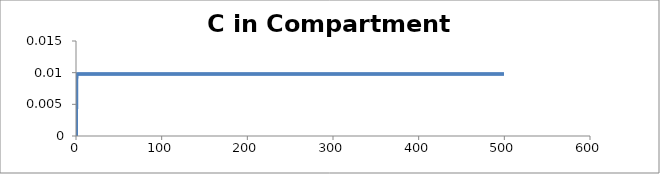
| Category | C - Sys 2 |
|---|---|
| 0.5 | 0 |
| 1.0 | 0.009 |
| 1.5 | 0.01 |
| 2.0 | 0.01 |
| 2.5 | 0.01 |
| 3.0 | 0.01 |
| 3.5 | 0.01 |
| 4.0 | 0.01 |
| 4.500000000000001 | 0.01 |
| 5.0 | 0.01 |
| 5.5 | 0.01 |
| 6.0 | 0.01 |
| 6.500000000000001 | 0.01 |
| 7.0 | 0.01 |
| 7.5 | 0.01 |
| 8.0 | 0.01 |
| 8.5 | 0.01 |
| 9.000000000000002 | 0.01 |
| 9.5 | 0.01 |
| 10.0 | 0.01 |
| 10.5 | 0.01 |
| 11.0 | 0.01 |
| 11.5 | 0.01 |
| 12.0 | 0.01 |
| 12.5 | 0.01 |
| 13.000000000000002 | 0.01 |
| 13.5 | 0.01 |
| 14.0 | 0.01 |
| 14.5 | 0.01 |
| 15.0 | 0.01 |
| 15.5 | 0.01 |
| 16.0 | 0.01 |
| 16.5 | 0.01 |
| 17.0 | 0.01 |
| 17.5 | 0.01 |
| 18.000000000000004 | 0.01 |
| 18.5 | 0.01 |
| 19.0 | 0.01 |
| 19.5 | 0.01 |
| 20.0 | 0.01 |
| 20.5 | 0.01 |
| 21.0 | 0.01 |
| 21.5 | 0.01 |
| 22.0 | 0.01 |
| 22.5 | 0.01 |
| 23.0 | 0.01 |
| 23.5 | 0.01 |
| 24.0 | 0.01 |
| 24.5 | 0.01 |
| 25.0 | 0.01 |
| 25.500000000000004 | 0.01 |
| 26.000000000000004 | 0.01 |
| 26.5 | 0.01 |
| 27.0 | 0.01 |
| 27.5 | 0.01 |
| 28.0 | 0.01 |
| 28.5 | 0.01 |
| 29.0 | 0.01 |
| 29.500000000000004 | 0.01 |
| 30.0 | 0.01 |
| 30.5 | 0.01 |
| 31.0 | 0.01 |
| 31.5 | 0.01 |
| 32.0 | 0.01 |
| 32.5 | 0.01 |
| 33.0 | 0.01 |
| 33.5 | 0.01 |
| 34.0 | 0.01 |
| 34.5 | 0.01 |
| 35.0 | 0.01 |
| 35.50000000000001 | 0.01 |
| 36.00000000000001 | 0.01 |
| 36.5 | 0.01 |
| 37.0 | 0.01 |
| 37.5 | 0.01 |
| 38.0 | 0.01 |
| 38.5 | 0.01 |
| 39.0 | 0.01 |
| 39.5 | 0.01 |
| 40.0 | 0.01 |
| 40.5 | 0.01 |
| 41.0 | 0.01 |
| 41.5 | 0.01 |
| 42.0 | 0.01 |
| 42.5 | 0.01 |
| 43.0 | 0.01 |
| 43.50000000000001 | 0.01 |
| 44.0 | 0.01 |
| 44.5 | 0.01 |
| 45.0 | 0.01 |
| 45.5 | 0.01 |
| 46.0 | 0.01 |
| 46.5 | 0.01 |
| 47.0 | 0.01 |
| 47.5 | 0.01 |
| 48.0 | 0.01 |
| 48.5 | 0.01 |
| 49.0 | 0.01 |
| 49.5 | 0.01 |
| 50.0 | 0.01 |
| 50.5 | 0.01 |
| 51.00000000000001 | 0.01 |
| 51.50000000000001 | 0.01 |
| 52.00000000000001 | 0.01 |
| 52.5 | 0.01 |
| 53.0 | 0.01 |
| 53.5 | 0.01 |
| 54.0 | 0.01 |
| 54.5 | 0.01 |
| 55.0 | 0.01 |
| 55.5 | 0.01 |
| 56.0 | 0.01 |
| 56.5 | 0.01 |
| 57.0 | 0.01 |
| 57.5 | 0.01 |
| 58.0 | 0.01 |
| 58.5 | 0.01 |
| 59.00000000000001 | 0.01 |
| 59.50000000000001 | 0.01 |
| 60.0 | 0.01 |
| 60.5 | 0.01 |
| 61.0 | 0.01 |
| 61.5 | 0.01 |
| 62.0 | 0.01 |
| 62.5 | 0.01 |
| 63.0 | 0.01 |
| 63.5 | 0.01 |
| 64.0 | 0.01 |
| 64.5 | 0.01 |
| 65.0 | 0.01 |
| 65.5 | 0.01 |
| 66.0 | 0.01 |
| 66.5 | 0.01 |
| 67.0 | 0.01 |
| 67.5 | 0.01 |
| 68.0 | 0.01 |
| 68.5 | 0.01 |
| 69.0 | 0.01 |
| 69.5 | 0.01 |
| 70.0 | 0.01 |
| 70.5 | 0.01 |
| 71.00000000000001 | 0.01 |
| 71.50000000000001 | 0.01 |
| 72.00000000000001 | 0.01 |
| 72.5 | 0.01 |
| 73.0 | 0.01 |
| 73.5 | 0.01 |
| 74.0 | 0.01 |
| 74.5 | 0.01 |
| 75.0 | 0.01 |
| 75.5 | 0.01 |
| 76.0 | 0.01 |
| 76.5 | 0.01 |
| 77.0 | 0.01 |
| 77.5 | 0.01 |
| 78.0 | 0.01 |
| 78.5 | 0.01 |
| 79.0 | 0.01 |
| 79.5 | 0.01 |
| 80.0 | 0.01 |
| 80.5 | 0.01 |
| 81.0 | 0.01 |
| 81.5 | 0.01 |
| 82.0 | 0.01 |
| 82.5 | 0.01 |
| 83.0 | 0.01 |
| 83.5 | 0.01 |
| 84.0 | 0.01 |
| 84.5 | 0.01 |
| 85.0 | 0.01 |
| 85.5 | 0.01 |
| 86.0 | 0.01 |
| 86.50000000000001 | 0.01 |
| 87.00000000000001 | 0.01 |
| 87.50000000000001 | 0.01 |
| 88.0 | 0.01 |
| 88.5 | 0.01 |
| 89.0 | 0.01 |
| 89.5 | 0.01 |
| 90.0 | 0.01 |
| 90.5 | 0.01 |
| 91.0 | 0.01 |
| 91.5 | 0.01 |
| 92.0 | 0.01 |
| 92.5 | 0.01 |
| 93.0 | 0.01 |
| 93.5 | 0.01 |
| 94.0 | 0.01 |
| 94.5 | 0.01 |
| 95.0 | 0.01 |
| 95.5 | 0.01 |
| 96.0 | 0.01 |
| 96.5 | 0.01 |
| 97.0 | 0.01 |
| 97.5 | 0.01 |
| 98.0 | 0.01 |
| 98.5 | 0.01 |
| 99.0 | 0.01 |
| 99.5 | 0.01 |
| 100.0 | 0.01 |
| 100.5 | 0.01 |
| 101.0 | 0.01 |
| 101.5 | 0.01 |
| 102.00000000000001 | 0.01 |
| 102.50000000000001 | 0.01 |
| 103.00000000000001 | 0.01 |
| 103.50000000000001 | 0.01 |
| 104.00000000000001 | 0.01 |
| 104.5 | 0.01 |
| 105.0 | 0.01 |
| 105.5 | 0.01 |
| 106.0 | 0.01 |
| 106.5 | 0.01 |
| 107.0 | 0.01 |
| 107.5 | 0.01 |
| 108.0 | 0.01 |
| 108.5 | 0.01 |
| 109.0 | 0.01 |
| 109.5 | 0.01 |
| 110.0 | 0.01 |
| 110.5 | 0.01 |
| 111.0 | 0.01 |
| 111.5 | 0.01 |
| 112.0 | 0.01 |
| 112.5 | 0.01 |
| 113.0 | 0.01 |
| 113.5 | 0.01 |
| 114.0 | 0.01 |
| 114.5 | 0.01 |
| 115.0 | 0.01 |
| 115.5 | 0.01 |
| 116.0 | 0.01 |
| 116.5 | 0.01 |
| 117.0 | 0.01 |
| 117.50000000000001 | 0.01 |
| 118.00000000000001 | 0.01 |
| 118.50000000000001 | 0.01 |
| 119.00000000000001 | 0.01 |
| 119.50000000000001 | 0.01 |
| 120.0 | 0.01 |
| 120.5 | 0.01 |
| 121.0 | 0.01 |
| 121.5 | 0.01 |
| 122.0 | 0.01 |
| 122.5 | 0.01 |
| 123.0 | 0.01 |
| 123.5 | 0.01 |
| 124.0 | 0.01 |
| 124.5 | 0.01 |
| 125.0 | 0.01 |
| 125.5 | 0.01 |
| 126.0 | 0.01 |
| 126.5 | 0.01 |
| 127.0 | 0.01 |
| 127.5 | 0.01 |
| 128.0 | 0.01 |
| 128.5 | 0.01 |
| 129.0 | 0.01 |
| 129.5 | 0.01 |
| 130.0 | 0.01 |
| 130.5 | 0.01 |
| 131.0 | 0.01 |
| 131.5 | 0.01 |
| 132.0 | 0.01 |
| 132.5 | 0.01 |
| 133.0 | 0.01 |
| 133.5 | 0.01 |
| 134.0 | 0.01 |
| 134.5 | 0.01 |
| 135.0 | 0.01 |
| 135.5 | 0.01 |
| 136.0 | 0.01 |
| 136.5 | 0.01 |
| 137.0 | 0.01 |
| 137.5 | 0.01 |
| 138.0 | 0.01 |
| 138.5 | 0.01 |
| 139.0 | 0.01 |
| 139.5 | 0.01 |
| 140.0 | 0.01 |
| 140.5 | 0.01 |
| 141.0 | 0.01 |
| 141.50000000000003 | 0.01 |
| 142.00000000000003 | 0.01 |
| 142.50000000000003 | 0.01 |
| 143.00000000000003 | 0.01 |
| 143.50000000000003 | 0.01 |
| 144.00000000000003 | 0.01 |
| 144.5 | 0.01 |
| 145.0 | 0.01 |
| 145.5 | 0.01 |
| 146.0 | 0.01 |
| 146.5 | 0.01 |
| 147.0 | 0.01 |
| 147.5 | 0.01 |
| 148.0 | 0.01 |
| 148.5 | 0.01 |
| 149.0 | 0.01 |
| 149.5 | 0.01 |
| 150.0 | 0.01 |
| 150.5 | 0.01 |
| 151.0 | 0.01 |
| 151.5 | 0.01 |
| 152.0 | 0.01 |
| 152.5 | 0.01 |
| 153.0 | 0.01 |
| 153.5 | 0.01 |
| 154.0 | 0.01 |
| 154.5 | 0.01 |
| 155.0 | 0.01 |
| 155.5 | 0.01 |
| 156.0 | 0.01 |
| 156.5 | 0.01 |
| 157.0 | 0.01 |
| 157.5 | 0.01 |
| 158.0 | 0.01 |
| 158.5 | 0.01 |
| 159.0 | 0.01 |
| 159.5 | 0.01 |
| 160.0 | 0.01 |
| 160.5 | 0.01 |
| 161.0 | 0.01 |
| 161.5 | 0.01 |
| 162.0 | 0.01 |
| 162.5 | 0.01 |
| 163.0 | 0.01 |
| 163.5 | 0.01 |
| 164.0 | 0.01 |
| 164.5 | 0.01 |
| 165.0 | 0.01 |
| 165.5 | 0.01 |
| 166.0 | 0.01 |
| 166.5 | 0.01 |
| 167.0 | 0.01 |
| 167.5 | 0.01 |
| 168.0 | 0.01 |
| 168.5 | 0.01 |
| 169.0 | 0.01 |
| 169.5 | 0.01 |
| 170.0 | 0.01 |
| 170.5 | 0.01 |
| 171.0 | 0.01 |
| 171.5 | 0.01 |
| 172.0 | 0.01 |
| 172.50000000000003 | 0.01 |
| 173.00000000000003 | 0.01 |
| 173.50000000000003 | 0.01 |
| 174.00000000000003 | 0.01 |
| 174.50000000000003 | 0.01 |
| 175.00000000000003 | 0.01 |
| 175.50000000000003 | 0.01 |
| 176.0 | 0.01 |
| 176.5 | 0.01 |
| 177.0 | 0.01 |
| 177.5 | 0.01 |
| 178.0 | 0.01 |
| 178.5 | 0.01 |
| 179.0 | 0.01 |
| 179.5 | 0.01 |
| 180.0 | 0.01 |
| 180.5 | 0.01 |
| 181.0 | 0.01 |
| 181.5 | 0.01 |
| 182.0 | 0.01 |
| 182.5 | 0.01 |
| 183.0 | 0.01 |
| 183.5 | 0.01 |
| 184.0 | 0.01 |
| 184.5 | 0.01 |
| 185.0 | 0.01 |
| 185.5 | 0.01 |
| 186.0 | 0.01 |
| 186.5 | 0.01 |
| 187.0 | 0.01 |
| 187.5 | 0.01 |
| 188.0 | 0.01 |
| 188.5 | 0.01 |
| 189.0 | 0.01 |
| 189.5 | 0.01 |
| 190.0 | 0.01 |
| 190.5 | 0.01 |
| 191.0 | 0.01 |
| 191.5 | 0.01 |
| 192.0 | 0.01 |
| 192.5 | 0.01 |
| 193.0 | 0.01 |
| 193.5 | 0.01 |
| 194.0 | 0.01 |
| 194.5 | 0.01 |
| 195.0 | 0.01 |
| 195.5 | 0.01 |
| 196.0 | 0.01 |
| 196.5 | 0.01 |
| 197.0 | 0.01 |
| 197.5 | 0.01 |
| 198.0 | 0.01 |
| 198.5 | 0.01 |
| 199.0 | 0.01 |
| 199.5 | 0.01 |
| 200.0 | 0.01 |
| 200.5 | 0.01 |
| 201.0 | 0.01 |
| 201.5 | 0.01 |
| 202.0 | 0.01 |
| 202.5 | 0.01 |
| 203.0 | 0.01 |
| 203.5 | 0.01 |
| 204.00000000000003 | 0.01 |
| 204.50000000000003 | 0.01 |
| 205.00000000000003 | 0.01 |
| 205.50000000000003 | 0.01 |
| 206.00000000000003 | 0.01 |
| 206.50000000000003 | 0.01 |
| 207.00000000000003 | 0.01 |
| 207.50000000000003 | 0.01 |
| 208.00000000000003 | 0.01 |
| 208.5 | 0.01 |
| 209.0 | 0.01 |
| 209.5 | 0.01 |
| 210.0 | 0.01 |
| 210.5 | 0.01 |
| 211.0 | 0.01 |
| 211.5 | 0.01 |
| 212.0 | 0.01 |
| 212.5 | 0.01 |
| 213.0 | 0.01 |
| 213.5 | 0.01 |
| 214.0 | 0.01 |
| 214.5 | 0.01 |
| 215.0 | 0.01 |
| 215.5 | 0.01 |
| 216.0 | 0.01 |
| 216.5 | 0.01 |
| 217.0 | 0.01 |
| 217.5 | 0.01 |
| 218.0 | 0.01 |
| 218.5 | 0.01 |
| 219.0 | 0.01 |
| 219.5 | 0.01 |
| 220.0 | 0.01 |
| 220.5 | 0.01 |
| 221.0 | 0.01 |
| 221.5 | 0.01 |
| 222.0 | 0.01 |
| 222.5 | 0.01 |
| 223.0 | 0.01 |
| 223.5 | 0.01 |
| 224.0 | 0.01 |
| 224.5 | 0.01 |
| 225.0 | 0.01 |
| 225.5 | 0.01 |
| 226.0 | 0.01 |
| 226.5 | 0.01 |
| 227.0 | 0.01 |
| 227.5 | 0.01 |
| 228.0 | 0.01 |
| 228.5 | 0.01 |
| 229.0 | 0.01 |
| 229.5 | 0.01 |
| 230.0 | 0.01 |
| 230.5 | 0.01 |
| 231.0 | 0.01 |
| 231.5 | 0.01 |
| 232.0 | 0.01 |
| 232.5 | 0.01 |
| 233.0 | 0.01 |
| 233.5 | 0.01 |
| 234.0 | 0.01 |
| 234.5 | 0.01 |
| 235.00000000000003 | 0.01 |
| 235.50000000000003 | 0.01 |
| 236.00000000000003 | 0.01 |
| 236.50000000000003 | 0.01 |
| 237.00000000000003 | 0.01 |
| 237.50000000000003 | 0.01 |
| 238.00000000000003 | 0.01 |
| 238.50000000000003 | 0.01 |
| 239.00000000000003 | 0.01 |
| 239.50000000000003 | 0.01 |
| 240.0 | 0.01 |
| 240.5 | 0.01 |
| 241.0 | 0.01 |
| 241.5 | 0.01 |
| 242.0 | 0.01 |
| 242.5 | 0.01 |
| 243.0 | 0.01 |
| 243.5 | 0.01 |
| 244.0 | 0.01 |
| 244.5 | 0.01 |
| 245.0 | 0.01 |
| 245.5 | 0.01 |
| 246.0 | 0.01 |
| 246.5 | 0.01 |
| 247.0 | 0.01 |
| 247.5 | 0.01 |
| 248.0 | 0.01 |
| 248.5 | 0.01 |
| 249.0 | 0.01 |
| 249.5 | 0.01 |
| 250.0 | 0.01 |
| 250.5 | 0.01 |
| 251.0 | 0.01 |
| 251.5 | 0.01 |
| 252.0 | 0.01 |
| 252.5 | 0.01 |
| 253.0 | 0.01 |
| 253.5 | 0.01 |
| 254.0 | 0.01 |
| 254.5 | 0.01 |
| 255.0 | 0.01 |
| 255.5 | 0.01 |
| 256.0 | 0.01 |
| 256.5 | 0.01 |
| 257.0 | 0.01 |
| 257.5 | 0.01 |
| 258.0 | 0.01 |
| 258.5 | 0.01 |
| 259.0 | 0.01 |
| 259.5 | 0.01 |
| 260.0 | 0.01 |
| 260.5 | 0.01 |
| 261.0 | 0.01 |
| 261.5 | 0.01 |
| 262.0 | 0.01 |
| 262.5 | 0.01 |
| 263.0 | 0.01 |
| 263.5 | 0.01 |
| 264.0 | 0.01 |
| 264.5 | 0.01 |
| 265.0 | 0.01 |
| 265.5 | 0.01 |
| 266.0 | 0.01 |
| 266.5 | 0.01 |
| 267.0 | 0.01 |
| 267.5 | 0.01 |
| 268.0 | 0.01 |
| 268.5 | 0.01 |
| 269.0 | 0.01 |
| 269.5 | 0.01 |
| 270.0 | 0.01 |
| 270.5 | 0.01 |
| 271.0 | 0.01 |
| 271.5 | 0.01 |
| 272.0 | 0.01 |
| 272.5 | 0.01 |
| 273.0 | 0.01 |
| 273.5 | 0.01 |
| 274.0 | 0.01 |
| 274.5 | 0.01 |
| 275.0 | 0.01 |
| 275.5 | 0.01 |
| 276.0 | 0.01 |
| 276.5 | 0.01 |
| 277.0 | 0.01 |
| 277.5 | 0.01 |
| 278.0 | 0.01 |
| 278.5 | 0.01 |
| 279.0 | 0.01 |
| 279.5 | 0.01 |
| 280.0 | 0.01 |
| 280.5 | 0.01 |
| 281.0 | 0.01 |
| 281.5 | 0.01 |
| 282.0 | 0.01 |
| 282.50000000000006 | 0.01 |
| 283.00000000000006 | 0.01 |
| 283.50000000000006 | 0.01 |
| 284.00000000000006 | 0.01 |
| 284.50000000000006 | 0.01 |
| 285.00000000000006 | 0.01 |
| 285.50000000000006 | 0.01 |
| 286.00000000000006 | 0.01 |
| 286.50000000000006 | 0.01 |
| 287.00000000000006 | 0.01 |
| 287.50000000000006 | 0.01 |
| 288.00000000000006 | 0.01 |
| 288.5 | 0.01 |
| 289.0 | 0.01 |
| 289.5 | 0.01 |
| 290.0 | 0.01 |
| 290.5 | 0.01 |
| 291.0 | 0.01 |
| 291.5 | 0.01 |
| 292.0 | 0.01 |
| 292.5 | 0.01 |
| 293.0 | 0.01 |
| 293.5 | 0.01 |
| 294.0 | 0.01 |
| 294.5 | 0.01 |
| 295.0 | 0.01 |
| 295.5 | 0.01 |
| 296.0 | 0.01 |
| 296.5 | 0.01 |
| 297.0 | 0.01 |
| 297.5 | 0.01 |
| 298.0 | 0.01 |
| 298.5 | 0.01 |
| 299.0 | 0.01 |
| 299.5 | 0.01 |
| 300.0 | 0.01 |
| 300.5 | 0.01 |
| 301.0 | 0.01 |
| 301.5 | 0.01 |
| 302.0 | 0.01 |
| 302.5 | 0.01 |
| 303.0 | 0.01 |
| 303.5 | 0.01 |
| 304.0 | 0.01 |
| 304.5 | 0.01 |
| 305.0 | 0.01 |
| 305.5 | 0.01 |
| 306.0 | 0.01 |
| 306.5 | 0.01 |
| 307.0 | 0.01 |
| 307.5 | 0.01 |
| 308.0 | 0.01 |
| 308.5 | 0.01 |
| 309.0 | 0.01 |
| 309.5 | 0.01 |
| 310.0 | 0.01 |
| 310.5 | 0.01 |
| 311.0 | 0.01 |
| 311.5 | 0.01 |
| 312.0 | 0.01 |
| 312.5 | 0.01 |
| 313.0 | 0.01 |
| 313.5 | 0.01 |
| 314.0 | 0.01 |
| 314.5 | 0.01 |
| 315.0 | 0.01 |
| 315.5 | 0.01 |
| 316.0 | 0.01 |
| 316.5 | 0.01 |
| 317.0 | 0.01 |
| 317.5 | 0.01 |
| 318.0 | 0.01 |
| 318.5 | 0.01 |
| 319.0 | 0.01 |
| 319.5 | 0.01 |
| 320.0 | 0.01 |
| 320.5 | 0.01 |
| 321.0 | 0.01 |
| 321.5 | 0.01 |
| 322.0 | 0.01 |
| 322.5 | 0.01 |
| 323.0 | 0.01 |
| 323.5 | 0.01 |
| 324.0 | 0.01 |
| 324.5 | 0.01 |
| 325.0 | 0.01 |
| 325.5 | 0.01 |
| 326.0 | 0.01 |
| 326.5 | 0.01 |
| 327.0 | 0.01 |
| 327.5 | 0.01 |
| 328.0 | 0.01 |
| 328.5 | 0.01 |
| 329.0 | 0.01 |
| 329.5 | 0.01 |
| 330.0 | 0.01 |
| 330.5 | 0.01 |
| 331.0 | 0.01 |
| 331.5 | 0.01 |
| 332.0 | 0.01 |
| 332.5 | 0.01 |
| 333.0 | 0.01 |
| 333.5 | 0.01 |
| 334.0 | 0.01 |
| 334.5 | 0.01 |
| 335.0 | 0.01 |
| 335.5 | 0.01 |
| 336.0 | 0.01 |
| 336.5 | 0.01 |
| 337.0 | 0.01 |
| 337.5 | 0.01 |
| 338.0 | 0.01 |
| 338.5 | 0.01 |
| 339.0 | 0.01 |
| 339.5 | 0.01 |
| 340.0 | 0.01 |
| 340.5 | 0.01 |
| 341.0 | 0.01 |
| 341.5 | 0.01 |
| 342.0 | 0.01 |
| 342.5 | 0.01 |
| 343.0 | 0.01 |
| 343.5 | 0.01 |
| 344.0 | 0.01 |
| 344.5 | 0.01 |
| 345.00000000000006 | 0.01 |
| 345.50000000000006 | 0.01 |
| 346.00000000000006 | 0.01 |
| 346.50000000000006 | 0.01 |
| 347.00000000000006 | 0.01 |
| 347.50000000000006 | 0.01 |
| 348.00000000000006 | 0.01 |
| 348.50000000000006 | 0.01 |
| 349.00000000000006 | 0.01 |
| 349.50000000000006 | 0.01 |
| 350.00000000000006 | 0.01 |
| 350.50000000000006 | 0.01 |
| 351.00000000000006 | 0.01 |
| 351.50000000000006 | 0.01 |
| 352.0 | 0.01 |
| 352.5 | 0.01 |
| 353.0 | 0.01 |
| 353.5 | 0.01 |
| 354.0 | 0.01 |
| 354.5 | 0.01 |
| 355.0 | 0.01 |
| 355.5 | 0.01 |
| 356.0 | 0.01 |
| 356.5 | 0.01 |
| 357.0 | 0.01 |
| 357.5 | 0.01 |
| 358.0 | 0.01 |
| 358.5 | 0.01 |
| 359.0 | 0.01 |
| 359.5 | 0.01 |
| 360.0 | 0.01 |
| 360.5 | 0.01 |
| 361.0 | 0.01 |
| 361.5 | 0.01 |
| 362.0 | 0.01 |
| 362.5 | 0.01 |
| 363.0 | 0.01 |
| 363.5 | 0.01 |
| 364.0 | 0.01 |
| 364.5 | 0.01 |
| 365.0 | 0.01 |
| 365.5 | 0.01 |
| 366.0 | 0.01 |
| 366.5 | 0.01 |
| 367.0 | 0.01 |
| 367.5 | 0.01 |
| 368.0 | 0.01 |
| 368.5 | 0.01 |
| 369.0 | 0.01 |
| 369.5 | 0.01 |
| 370.0 | 0.01 |
| 370.5 | 0.01 |
| 371.0 | 0.01 |
| 371.5 | 0.01 |
| 372.0 | 0.01 |
| 372.5 | 0.01 |
| 373.0 | 0.01 |
| 373.5 | 0.01 |
| 374.0 | 0.01 |
| 374.5 | 0.01 |
| 375.0 | 0.01 |
| 375.5 | 0.01 |
| 376.0 | 0.01 |
| 376.5 | 0.01 |
| 377.0 | 0.01 |
| 377.5 | 0.01 |
| 378.0 | 0.01 |
| 378.5 | 0.01 |
| 379.0 | 0.01 |
| 379.5 | 0.01 |
| 380.0 | 0.01 |
| 380.5 | 0.01 |
| 381.0 | 0.01 |
| 381.5 | 0.01 |
| 382.0 | 0.01 |
| 382.5 | 0.01 |
| 383.0 | 0.01 |
| 383.5 | 0.01 |
| 384.0 | 0.01 |
| 384.5 | 0.01 |
| 385.0 | 0.01 |
| 385.5 | 0.01 |
| 386.0 | 0.01 |
| 386.5 | 0.01 |
| 387.0 | 0.01 |
| 387.5 | 0.01 |
| 388.0 | 0.01 |
| 388.5 | 0.01 |
| 389.0 | 0.01 |
| 389.5 | 0.01 |
| 390.0 | 0.01 |
| 390.5 | 0.01 |
| 391.0 | 0.01 |
| 391.5 | 0.01 |
| 392.0 | 0.01 |
| 392.5 | 0.01 |
| 393.0 | 0.01 |
| 393.5 | 0.01 |
| 394.0 | 0.01 |
| 394.5 | 0.01 |
| 395.0 | 0.01 |
| 395.5 | 0.01 |
| 396.0 | 0.01 |
| 396.5 | 0.01 |
| 397.0 | 0.01 |
| 397.5 | 0.01 |
| 398.0 | 0.01 |
| 398.5 | 0.01 |
| 399.0 | 0.01 |
| 399.5 | 0.01 |
| 400.0 | 0.01 |
| 400.5 | 0.01 |
| 401.0 | 0.01 |
| 401.5 | 0.01 |
| 402.0 | 0.01 |
| 402.5 | 0.01 |
| 403.0 | 0.01 |
| 403.5 | 0.01 |
| 404.0 | 0.01 |
| 404.5 | 0.01 |
| 405.0 | 0.01 |
| 405.5 | 0.01 |
| 406.0 | 0.01 |
| 406.5 | 0.01 |
| 407.0 | 0.01 |
| 407.50000000000006 | 0.01 |
| 408.00000000000006 | 0.01 |
| 408.50000000000006 | 0.01 |
| 409.00000000000006 | 0.01 |
| 409.50000000000006 | 0.01 |
| 410.00000000000006 | 0.01 |
| 410.50000000000006 | 0.01 |
| 411.00000000000006 | 0.01 |
| 411.50000000000006 | 0.01 |
| 412.00000000000006 | 0.01 |
| 412.50000000000006 | 0.01 |
| 413.00000000000006 | 0.01 |
| 413.50000000000006 | 0.01 |
| 414.00000000000006 | 0.01 |
| 414.50000000000006 | 0.01 |
| 415.00000000000006 | 0.01 |
| 415.50000000000006 | 0.01 |
| 416.00000000000006 | 0.01 |
| 416.5 | 0.01 |
| 417.0 | 0.01 |
| 417.5 | 0.01 |
| 418.0 | 0.01 |
| 418.5 | 0.01 |
| 419.0 | 0.01 |
| 419.5 | 0.01 |
| 420.0 | 0.01 |
| 420.5 | 0.01 |
| 421.0 | 0.01 |
| 421.5 | 0.01 |
| 422.0 | 0.01 |
| 422.5 | 0.01 |
| 423.0 | 0.01 |
| 423.5 | 0.01 |
| 424.0 | 0.01 |
| 424.5 | 0.01 |
| 425.0 | 0.01 |
| 425.5 | 0.01 |
| 426.0 | 0.01 |
| 426.5 | 0.01 |
| 427.0 | 0.01 |
| 427.5 | 0.01 |
| 428.0 | 0.01 |
| 428.5 | 0.01 |
| 429.0 | 0.01 |
| 429.5 | 0.01 |
| 430.0 | 0.01 |
| 430.5 | 0.01 |
| 431.0 | 0.01 |
| 431.5 | 0.01 |
| 432.0 | 0.01 |
| 432.5 | 0.01 |
| 433.0 | 0.01 |
| 433.5 | 0.01 |
| 434.0 | 0.01 |
| 434.5 | 0.01 |
| 435.0 | 0.01 |
| 435.5 | 0.01 |
| 436.0 | 0.01 |
| 436.5 | 0.01 |
| 437.0 | 0.01 |
| 437.5 | 0.01 |
| 438.0 | 0.01 |
| 438.5 | 0.01 |
| 439.0 | 0.01 |
| 439.5 | 0.01 |
| 440.0 | 0.01 |
| 440.5 | 0.01 |
| 441.0 | 0.01 |
| 441.5 | 0.01 |
| 442.0 | 0.01 |
| 442.5 | 0.01 |
| 443.0 | 0.01 |
| 443.5 | 0.01 |
| 444.0 | 0.01 |
| 444.5 | 0.01 |
| 445.0 | 0.01 |
| 445.5 | 0.01 |
| 446.0 | 0.01 |
| 446.5 | 0.01 |
| 447.0 | 0.01 |
| 447.5 | 0.01 |
| 448.0 | 0.01 |
| 448.5 | 0.01 |
| 449.0 | 0.01 |
| 449.5 | 0.01 |
| 450.0 | 0.01 |
| 450.5 | 0.01 |
| 451.0 | 0.01 |
| 451.5 | 0.01 |
| 452.0 | 0.01 |
| 452.5 | 0.01 |
| 453.0 | 0.01 |
| 453.5 | 0.01 |
| 454.0 | 0.01 |
| 454.5 | 0.01 |
| 455.0 | 0.01 |
| 455.5 | 0.01 |
| 456.0 | 0.01 |
| 456.5 | 0.01 |
| 457.0 | 0.01 |
| 457.5 | 0.01 |
| 458.0 | 0.01 |
| 458.5 | 0.01 |
| 459.0 | 0.01 |
| 459.5 | 0.01 |
| 460.0 | 0.01 |
| 460.5 | 0.01 |
| 461.0 | 0.01 |
| 461.5 | 0.01 |
| 462.0 | 0.01 |
| 462.5 | 0.01 |
| 463.0 | 0.01 |
| 463.5 | 0.01 |
| 464.0 | 0.01 |
| 464.5 | 0.01 |
| 465.0 | 0.01 |
| 465.5 | 0.01 |
| 466.0 | 0.01 |
| 466.5 | 0.01 |
| 467.0 | 0.01 |
| 467.5 | 0.01 |
| 468.0 | 0.01 |
| 468.5 | 0.01 |
| 469.0 | 0.01 |
| 469.5 | 0.01 |
| 470.00000000000006 | 0.01 |
| 470.50000000000006 | 0.01 |
| 471.00000000000006 | 0.01 |
| 471.50000000000006 | 0.01 |
| 472.00000000000006 | 0.01 |
| 472.50000000000006 | 0.01 |
| 473.00000000000006 | 0.01 |
| 473.50000000000006 | 0.01 |
| 474.00000000000006 | 0.01 |
| 474.50000000000006 | 0.01 |
| 475.00000000000006 | 0.01 |
| 475.50000000000006 | 0.01 |
| 476.00000000000006 | 0.01 |
| 476.50000000000006 | 0.01 |
| 477.00000000000006 | 0.01 |
| 477.50000000000006 | 0.01 |
| 478.00000000000006 | 0.01 |
| 478.50000000000006 | 0.01 |
| 479.00000000000006 | 0.01 |
| 479.50000000000006 | 0.01 |
| 480.0 | 0.01 |
| 480.5 | 0.01 |
| 481.0 | 0.01 |
| 481.5 | 0.01 |
| 482.0 | 0.01 |
| 482.5 | 0.01 |
| 483.0 | 0.01 |
| 483.5 | 0.01 |
| 484.0 | 0.01 |
| 484.5 | 0.01 |
| 485.0 | 0.01 |
| 485.5 | 0.01 |
| 486.0 | 0.01 |
| 486.5 | 0.01 |
| 487.0 | 0.01 |
| 487.5 | 0.01 |
| 488.0 | 0.01 |
| 488.5 | 0.01 |
| 489.0 | 0.01 |
| 489.5 | 0.01 |
| 490.0 | 0.01 |
| 490.5 | 0.01 |
| 491.0 | 0.01 |
| 491.5 | 0.01 |
| 492.0 | 0.01 |
| 492.5 | 0.01 |
| 493.0 | 0.01 |
| 493.5 | 0.01 |
| 494.0 | 0.01 |
| 494.5 | 0.01 |
| 495.0 | 0.01 |
| 495.5 | 0.01 |
| 496.0 | 0.01 |
| 496.5 | 0.01 |
| 497.0 | 0.01 |
| 497.5 | 0.01 |
| 498.0 | 0.01 |
| 498.5 | 0.01 |
| 499.0 | 0.01 |
| 499.5 | 0.01 |
| 500.0 | 0.01 |